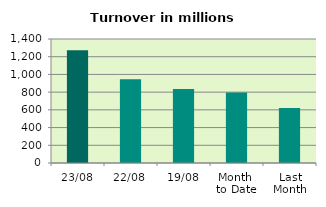
| Category | Series 0 |
|---|---|
| 23/08 | 1272.709 |
| 22/08 | 946.622 |
| 19/08 | 836.892 |
| Month 
to Date | 795.307 |
| Last
Month | 622.259 |